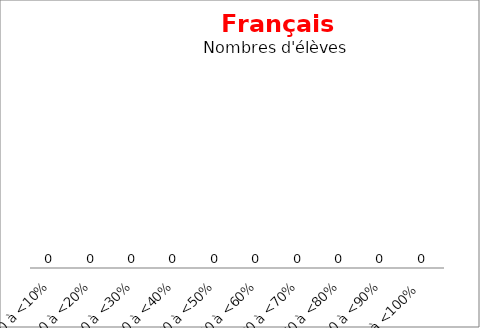
| Category | Series 0 |
|---|---|
| 0 à <10% | 0 |
| 10 à <20% | 0 |
| 20 à <30% | 0 |
| 30 à <40% | 0 |
| 40 à <50% | 0 |
| 50 à <60% | 0 |
| 60 à <70% | 0 |
| 70 à <80% | 0 |
| 80 à <90% | 0 |
| 90 à <100% | 0 |